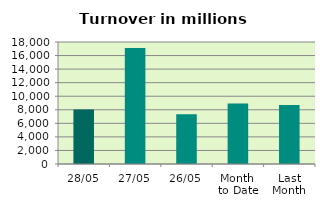
| Category | Series 0 |
|---|---|
| 28/05 | 8050.58 |
| 27/05 | 17103.368 |
| 26/05 | 7330.715 |
| Month 
to Date | 8912.063 |
| Last
Month | 8713.977 |